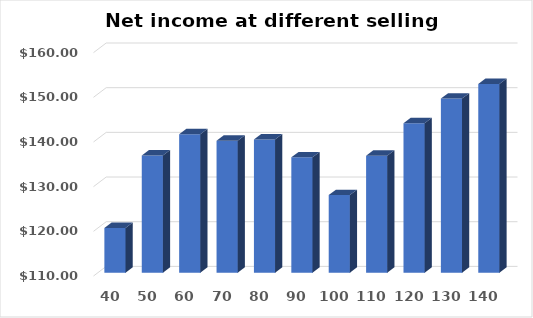
| Category | Series 0 |
|---|---|
| 40.0 | 120 |
| 50.0 | 136.25 |
| 60.0 | 141 |
| 70.0 | 139.525 |
| 80.0 | 139.825 |
| 90.0 | 135.825 |
| 100.0 | 127.375 |
| 110.0 | 136.175 |
| 120.0 | 143.475 |
| 130.0 | 148.975 |
| 140.0 | 152.225 |